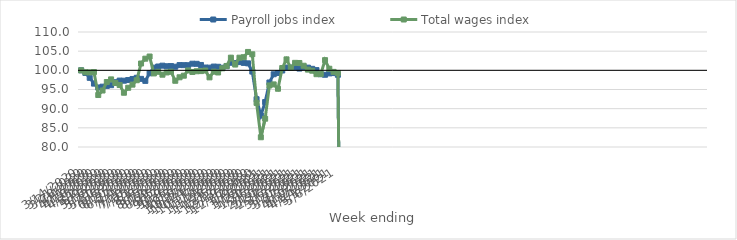
| Category | Payroll jobs index | Total wages index |
|---|---|---|
| 14/03/2020 | 100 | 100 |
| 21/03/2020 | 99.312 | 99.498 |
| 28/03/2020 | 98.043 | 99.461 |
| 04/04/2020 | 96.537 | 99.544 |
| 11/04/2020 | 95.533 | 93.558 |
| 18/04/2020 | 95.74 | 94.733 |
| 25/04/2020 | 95.935 | 96.953 |
| 02/05/2020 | 96.128 | 97.639 |
| 09/05/2020 | 96.907 | 96.693 |
| 16/05/2020 | 97.327 | 96.169 |
| 23/05/2020 | 97.297 | 94.152 |
| 30/05/2020 | 97.468 | 95.449 |
| 06/06/2020 | 97.747 | 96.27 |
| 13/06/2020 | 98.061 | 97.413 |
| 20/06/2020 | 97.772 | 101.778 |
| 27/06/2020 | 97.248 | 103.041 |
| 04/07/2020 | 99.239 | 103.602 |
| 11/07/2020 | 100.696 | 99.192 |
| 18/07/2020 | 100.997 | 99.621 |
| 25/07/2020 | 101.22 | 98.86 |
| 01/08/2020 | 101.066 | 99.446 |
| 08/08/2020 | 101.111 | 99.641 |
| 15/08/2020 | 100.944 | 97.275 |
| 22/08/2020 | 101.368 | 98.186 |
| 29/08/2020 | 101.347 | 98.6 |
| 05/09/2020 | 101.338 | 99.973 |
| 12/09/2020 | 101.73 | 99.573 |
| 19/09/2020 | 101.697 | 99.757 |
| 26/09/2020 | 101.403 | 99.799 |
| 03/10/2020 | 100.732 | 99.952 |
| 10/10/2020 | 100.7 | 98.171 |
| 17/10/2020 | 100.981 | 99.65 |
| 24/10/2020 | 100.928 | 99.441 |
| 31/10/2020 | 100.669 | 100.531 |
| 07/11/2020 | 101.076 | 101.143 |
| 14/11/2020 | 101.972 | 103.307 |
| 21/11/2020 | 101.913 | 101.506 |
| 28/11/2020 | 102.151 | 103.301 |
| 05/12/2020 | 101.94 | 103.429 |
| 12/12/2020 | 101.822 | 104.798 |
| 19/12/2020 | 99.669 | 104.18 |
| 26/12/2020 | 92.47 | 91.5 |
| 02/01/2021 | 88.215 | 82.541 |
| 09/01/2021 | 91.727 | 87.384 |
| 16/01/2021 | 96.826 | 96.058 |
| 23/01/2021 | 98.976 | 96.332 |
| 30/01/2021 | 99.291 | 95.195 |
| 06/02/2021 | 99.954 | 100.598 |
| 13/02/2021 | 100.726 | 102.863 |
| 20/02/2021 | 100.712 | 100.656 |
| 27/02/2021 | 100.759 | 101.951 |
| 06/03/2021 | 100.462 | 101.914 |
| 13/03/2021 | 100.824 | 101.198 |
| 20/03/2021 | 100.7 | 100.192 |
| 27/03/2021 | 100.391 | 99.902 |
| 03/04/2021 | 100.059 | 98.992 |
| 10/04/2021 | 98.976 | 99.062 |
| 17/04/2021 | 98.844 | 102.656 |
| 24/04/2021 | 99.196 | 100.416 |
| 01/05/2021 | 99.284 | 99.595 |
| 08/05/2021 | 98.832 | 99.313 |